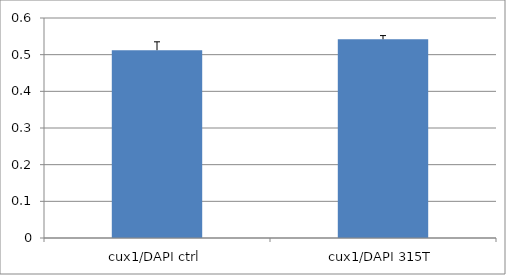
| Category | Series 0 |
|---|---|
| cux1/DAPI ctrl | 0.512 |
| cux1/DAPI 315T | 0.542 |